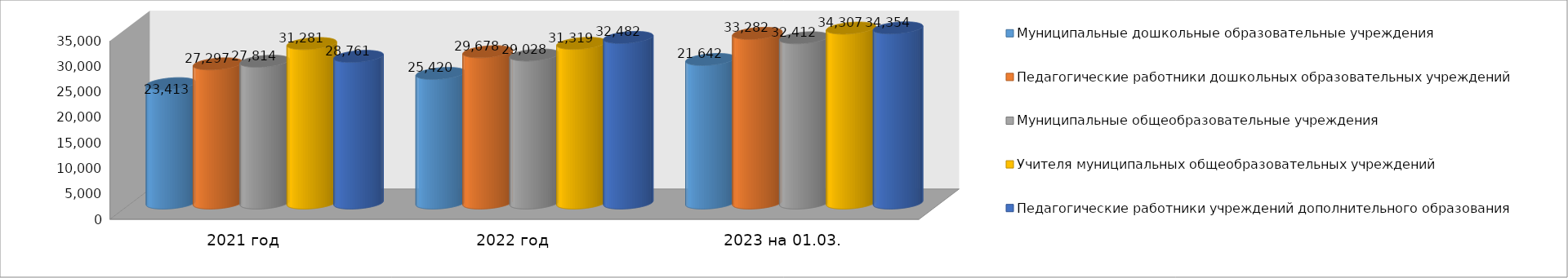
| Category | Муниципальные дошкольные образовательные учреждения | Педагогические работники дошкольных образовательных учреждений | Муниципальные общеобразовательные учреждения | Учителя муниципальных общеобразовательных учреждений | Педагогические работники учреждений дополнительного образования |
|---|---|---|---|---|---|
| 2021 год | 23413 | 27297 | 27814 | 31281 | 28761 |
| 2022 год | 25420 | 29678 | 29028 | 31319 | 32482 |
| 2023 на 01.03. | 28156 | 33282 | 32412 | 34307 | 34354 |